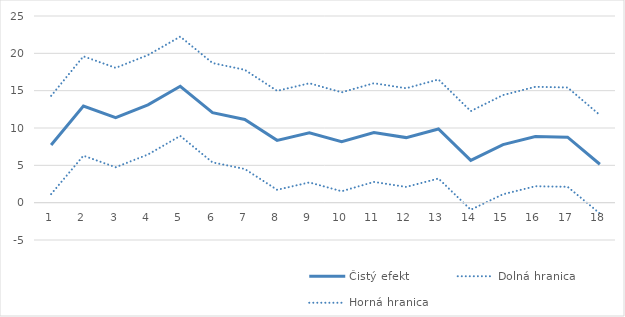
| Category | Čistý efekt | Dolná hranica | Horná hranica |
|---|---|---|---|
| 1.0 | 7.728 | 1.15 | 14.305 |
| 2.0 | 12.945 | 6.292 | 19.599 |
| 3.0 | 11.401 | 4.747 | 18.055 |
| 4.0 | 13.108 | 6.45 | 19.765 |
| 5.0 | 15.591 | 8.942 | 22.24 |
| 6.0 | 12.048 | 5.395 | 18.702 |
| 7.0 | 11.149 | 4.509 | 17.788 |
| 8.0 | 8.348 | 1.721 | 14.974 |
| 9.0 | 9.352 | 2.713 | 15.991 |
| 10.0 | 8.153 | 1.526 | 14.78 |
| 11.0 | 9.387 | 2.779 | 15.996 |
| 12.0 | 8.714 | 2.107 | 15.322 |
| 13.0 | 9.868 | 3.236 | 16.501 |
| 14.0 | 5.655 | -0.949 | 12.26 |
| 15.0 | 7.768 | 1.125 | 14.411 |
| 16.0 | 8.858 | 2.197 | 15.519 |
| 17.0 | 8.775 | 2.126 | 15.424 |
| 18.0 | 5.144 | -1.447 | 11.735 |